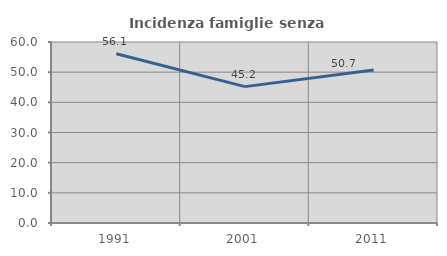
| Category | Incidenza famiglie senza nuclei |
|---|---|
| 1991.0 | 56.122 |
| 2001.0 | 45.205 |
| 2011.0 | 50.685 |